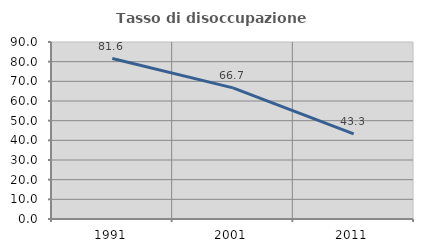
| Category | Tasso di disoccupazione giovanile  |
|---|---|
| 1991.0 | 81.609 |
| 2001.0 | 66.667 |
| 2011.0 | 43.333 |